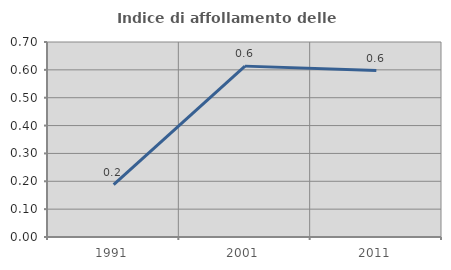
| Category | Indice di affollamento delle abitazioni  |
|---|---|
| 1991.0 | 0.188 |
| 2001.0 | 0.613 |
| 2011.0 | 0.597 |